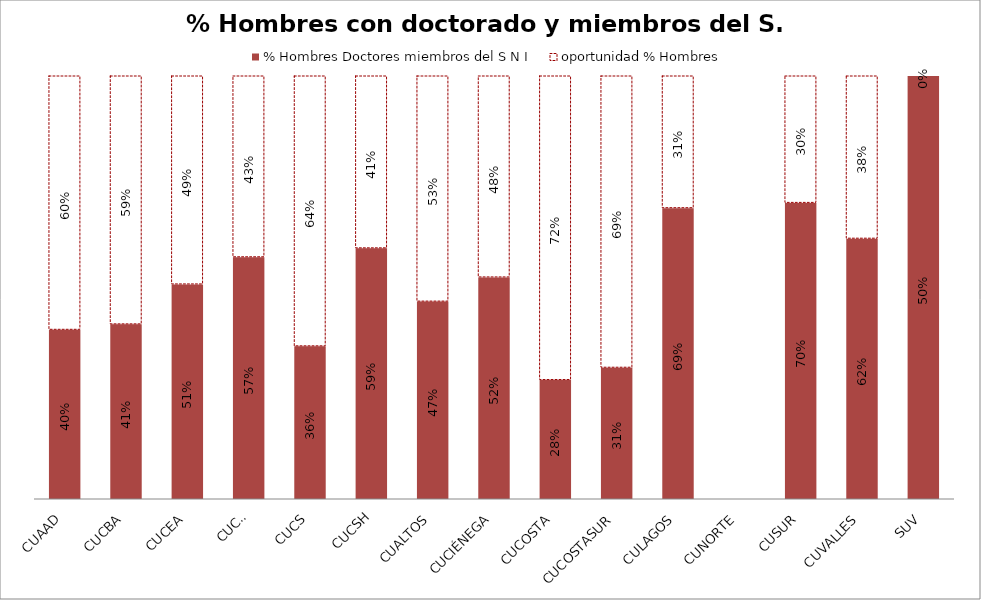
| Category | % Hombres Doctores miembros del S N I  | oportunidad % Hombres |
|---|---|---|
| CUAAD | 0.4 | 0.6 |
| CUCBA | 0.413 | 0.587 |
| CUCEA | 0.507 | 0.493 |
| CUCEI | 0.571 | 0.429 |
| CUCS | 0.361 | 0.639 |
| CUCSH | 0.593 | 0.407 |
| CUALTOS | 0.467 | 0.533 |
| CUCIÉNEGA | 0.524 | 0.476 |
| CUCOSTA | 0.281 | 0.719 |
| CUCOSTASUR | 0.31 | 0.69 |
| CULAGOS | 0.688 | 0.312 |
| CUNORTE | 0 | 0 |
| CUSUR | 0.7 | 0.3 |
| CUVALLES | 0.615 | 0.385 |
| SUV | 0.5 | 0 |